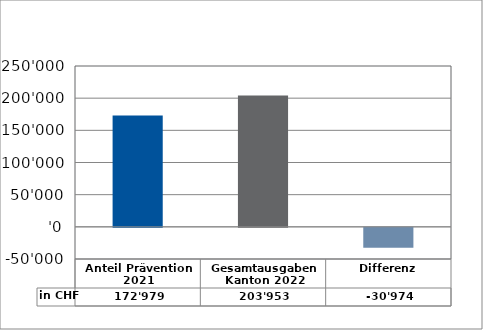
| Category | in CHF |
|---|---|
| Anteil Prävention 2021

 | 172978.65 |
| Gesamtausgaben Kanton 2022
 | 203952.85 |
| Differenz | -30974.2 |